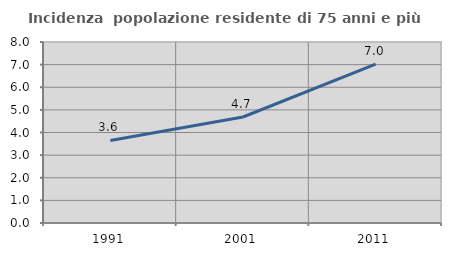
| Category | Incidenza  popolazione residente di 75 anni e più |
|---|---|
| 1991.0 | 3.647 |
| 2001.0 | 4.685 |
| 2011.0 | 7.02 |